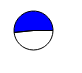
| Category | Series 0 |
|---|---|
| 0 | 11391472 |
| 1 | 12156898 |